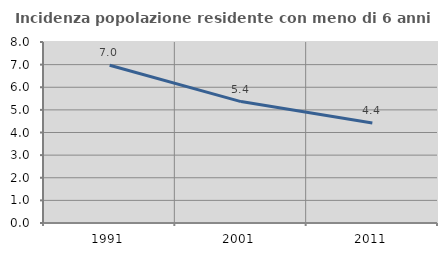
| Category | Incidenza popolazione residente con meno di 6 anni |
|---|---|
| 1991.0 | 6.971 |
| 2001.0 | 5.367 |
| 2011.0 | 4.425 |